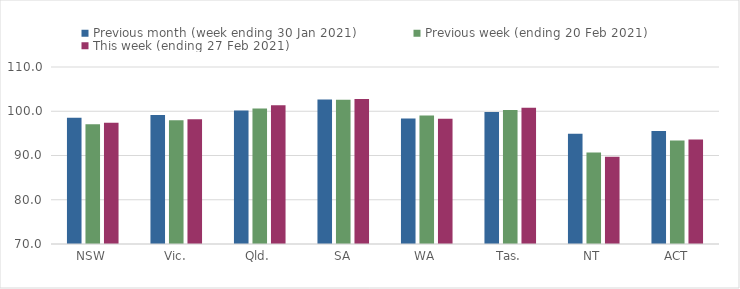
| Category | Previous month (week ending 30 Jan 2021) | Previous week (ending 20 Feb 2021) | This week (ending 27 Feb 2021) |
|---|---|---|---|
| NSW | 98.54 | 97.09 | 97.41 |
| Vic. | 99.16 | 97.98 | 98.19 |
| Qld. | 100.15 | 100.64 | 101.34 |
| SA | 102.64 | 102.58 | 102.75 |
| WA | 98.38 | 99.02 | 98.31 |
| Tas. | 99.83 | 100.28 | 100.77 |
| NT | 94.9 | 90.67 | 89.69 |
| ACT | 95.54 | 93.39 | 93.59 |